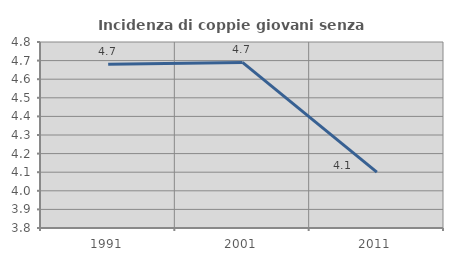
| Category | Incidenza di coppie giovani senza figli |
|---|---|
| 1991.0 | 4.68 |
| 2001.0 | 4.69 |
| 2011.0 | 4.1 |